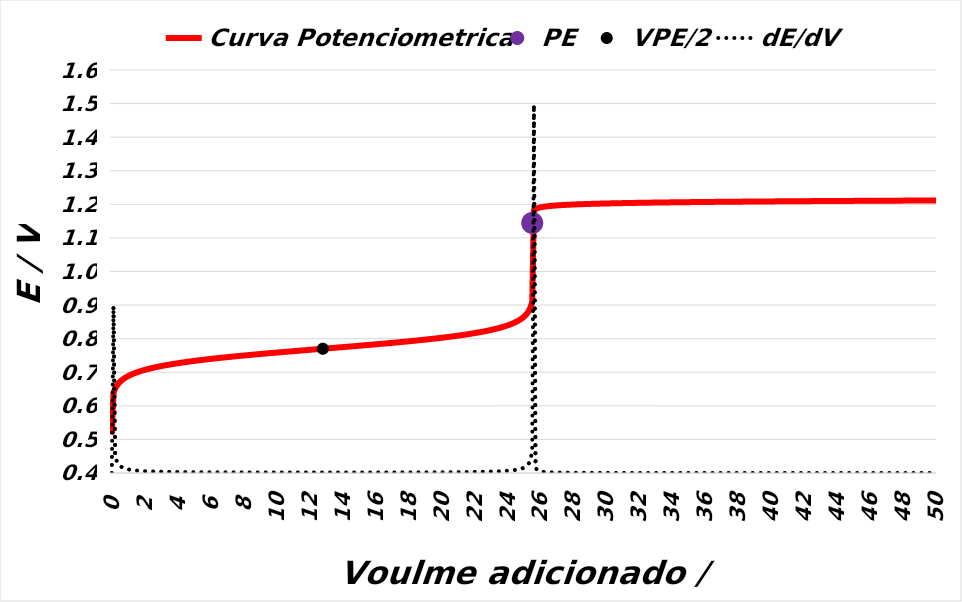
| Category | Curva Potenciometrica | PE | VPE/2 |
|---|---|---|---|
| 0.0 | 0.515 | 0 | 0 |
| 0.1 | 0.638 | 0 | 0 |
| 0.2 | 0.651 | 0 | 0 |
| 0.3 | 0.66 | 0 | 0 |
| 0.4 | 0.666 | 0 | 0 |
| 0.5 | 0.672 | 0 | 0 |
| 0.6 | 0.676 | 0 | 0 |
| 0.7 | 0.68 | 0 | 0 |
| 0.8 | 0.683 | 0 | 0 |
| 0.9 | 0.686 | 0 | 0 |
| 1.0 | 0.689 | 0 | 0 |
| 1.1 | 0.691 | 0 | 0 |
| 1.2 | 0.694 | 0 | 0 |
| 1.3 | 0.696 | 0 | 0 |
| 1.4 | 0.698 | 0 | 0 |
| 1.5 | 0.699 | 0 | 0 |
| 1.6 | 0.701 | 0 | 0 |
| 1.7 | 0.703 | 0 | 0 |
| 1.8 | 0.704 | 0 | 0 |
| 1.9 | 0.706 | 0 | 0 |
| 2.0 | 0.707 | 0 | 0 |
| 2.1 | 0.708 | 0 | 0 |
| 2.2 | 0.71 | 0 | 0 |
| 2.3 | 0.711 | 0 | 0 |
| 2.4 | 0.712 | 0 | 0 |
| 2.5 | 0.713 | 0 | 0 |
| 2.6 | 0.714 | 0 | 0 |
| 2.7 | 0.715 | 0 | 0 |
| 2.8 | 0.716 | 0 | 0 |
| 2.9 | 0.717 | 0 | 0 |
| 3.0 | 0.718 | 0 | 0 |
| 3.1 | 0.719 | 0 | 0 |
| 3.2 | 0.72 | 0 | 0 |
| 3.3 | 0.721 | 0 | 0 |
| 3.4 | 0.722 | 0 | 0 |
| 3.5 | 0.723 | 0 | 0 |
| 3.6 | 0.724 | 0 | 0 |
| 3.7 | 0.725 | 0 | 0 |
| 3.8 | 0.725 | 0 | 0 |
| 3.9 | 0.726 | 0 | 0 |
| 4.0 | 0.727 | 0 | 0 |
| 4.1 | 0.728 | 0 | 0 |
| 4.2 | 0.728 | 0 | 0 |
| 4.3 | 0.729 | 0 | 0 |
| 4.4 | 0.73 | 0 | 0 |
| 4.5 | 0.73 | 0 | 0 |
| 4.6 | 0.731 | 0 | 0 |
| 4.7 | 0.732 | 0 | 0 |
| 4.8 | 0.732 | 0 | 0 |
| 4.9 | 0.733 | 0 | 0 |
| 5.0 | 0.734 | 0 | 0 |
| 5.1 | 0.734 | 0 | 0 |
| 5.2 | 0.735 | 0 | 0 |
| 5.3 | 0.736 | 0 | 0 |
| 5.4 | 0.736 | 0 | 0 |
| 5.5 | 0.737 | 0 | 0 |
| 5.6 | 0.737 | 0 | 0 |
| 5.7 | 0.738 | 0 | 0 |
| 5.8 | 0.739 | 0 | 0 |
| 5.9 | 0.739 | 0 | 0 |
| 6.0 | 0.74 | 0 | 0 |
| 6.1 | 0.74 | 0 | 0 |
| 6.2 | 0.741 | 0 | 0 |
| 6.3 | 0.741 | 0 | 0 |
| 6.4 | 0.742 | 0 | 0 |
| 6.5 | 0.742 | 0 | 0 |
| 6.6 | 0.743 | 0 | 0 |
| 6.7 | 0.743 | 0 | 0 |
| 6.8 | 0.744 | 0 | 0 |
| 6.9 | 0.744 | 0 | 0 |
| 7.0 | 0.745 | 0 | 0 |
| 7.1 | 0.745 | 0 | 0 |
| 7.2 | 0.746 | 0 | 0 |
| 7.3 | 0.746 | 0 | 0 |
| 7.4 | 0.747 | 0 | 0 |
| 7.5 | 0.747 | 0 | 0 |
| 7.6 | 0.748 | 0 | 0 |
| 7.7 | 0.748 | 0 | 0 |
| 7.8 | 0.749 | 0 | 0 |
| 7.9 | 0.749 | 0 | 0 |
| 8.0 | 0.75 | 0 | 0 |
| 8.1 | 0.75 | 0 | 0 |
| 8.2 | 0.751 | 0 | 0 |
| 8.3 | 0.751 | 0 | 0 |
| 8.4 | 0.752 | 0 | 0 |
| 8.5 | 0.752 | 0 | 0 |
| 8.6 | 0.753 | 0 | 0 |
| 8.7 | 0.753 | 0 | 0 |
| 8.8 | 0.753 | 0 | 0 |
| 8.9 | 0.754 | 0 | 0 |
| 9.0 | 0.754 | 0 | 0 |
| 9.1 | 0.755 | 0 | 0 |
| 9.2 | 0.755 | 0 | 0 |
| 9.3 | 0.756 | 0 | 0 |
| 9.4 | 0.756 | 0 | 0 |
| 9.5 | 0.756 | 0 | 0 |
| 9.6 | 0.757 | 0 | 0 |
| 9.7 | 0.757 | 0 | 0 |
| 9.8 | 0.758 | 0 | 0 |
| 9.9 | 0.758 | 0 | 0 |
| 10.0 | 0.759 | 0 | 0 |
| 10.1 | 0.759 | 0 | 0 |
| 10.2 | 0.759 | 0 | 0 |
| 10.3 | 0.76 | 0 | 0 |
| 10.4 | 0.76 | 0 | 0 |
| 10.5 | 0.761 | 0 | 0 |
| 10.6 | 0.761 | 0 | 0 |
| 10.7 | 0.762 | 0 | 0 |
| 10.8 | 0.762 | 0 | 0 |
| 10.9 | 0.762 | 0 | 0 |
| 11.0 | 0.763 | 0 | 0 |
| 11.1 | 0.763 | 0 | 0 |
| 11.2 | 0.764 | 0 | 0 |
| 11.3 | 0.764 | 0 | 0 |
| 11.4 | 0.764 | 0 | 0 |
| 11.5 | 0.765 | 0 | 0 |
| 11.6 | 0.765 | 0 | 0 |
| 11.7 | 0.766 | 0 | 0 |
| 11.8 | 0.766 | 0 | 0 |
| 11.9 | 0.766 | 0 | 0 |
| 12.0 | 0.767 | 0 | 0 |
| 12.1 | 0.767 | 0 | 0 |
| 12.2 | 0.768 | 0 | 0 |
| 12.3 | 0.768 | 0 | 0 |
| 12.4 | 0.768 | 0 | 0 |
| 12.5 | 0.769 | 0 | 0 |
| 12.6 | 0.769 | 0 | 0 |
| 12.7 | 0.77 | 0 | 0 |
| 12.8 | 0.77 | 0 | 0.77 |
| 12.9 | 0.77 | 0 | 0 |
| 13.0 | 0.771 | 0 | 0 |
| 13.1 | 0.771 | 0 | 0 |
| 13.2 | 0.772 | 0 | 0 |
| 13.3 | 0.772 | 0 | 0 |
| 13.4 | 0.772 | 0 | 0 |
| 13.5 | 0.773 | 0 | 0 |
| 13.6 | 0.773 | 0 | 0 |
| 13.7 | 0.774 | 0 | 0 |
| 13.8 | 0.774 | 0 | 0 |
| 13.9 | 0.774 | 0 | 0 |
| 14.0 | 0.775 | 0 | 0 |
| 14.1 | 0.775 | 0 | 0 |
| 14.2 | 0.776 | 0 | 0 |
| 14.3 | 0.776 | 0 | 0 |
| 14.4 | 0.776 | 0 | 0 |
| 14.5 | 0.777 | 0 | 0 |
| 14.6 | 0.777 | 0 | 0 |
| 14.7 | 0.778 | 0 | 0 |
| 14.8 | 0.778 | 0 | 0 |
| 14.9 | 0.779 | 0 | 0 |
| 15.0 | 0.779 | 0 | 0 |
| 15.1 | 0.779 | 0 | 0 |
| 15.2 | 0.78 | 0 | 0 |
| 15.3 | 0.78 | 0 | 0 |
| 15.4 | 0.781 | 0 | 0 |
| 15.5 | 0.781 | 0 | 0 |
| 15.6 | 0.781 | 0 | 0 |
| 15.7 | 0.782 | 0 | 0 |
| 15.8 | 0.782 | 0 | 0 |
| 15.9 | 0.783 | 0 | 0 |
| 16.0 | 0.783 | 0 | 0 |
| 16.1 | 0.784 | 0 | 0 |
| 16.2 | 0.784 | 0 | 0 |
| 16.3 | 0.784 | 0 | 0 |
| 16.4 | 0.785 | 0 | 0 |
| 16.5 | 0.785 | 0 | 0 |
| 16.6 | 0.786 | 0 | 0 |
| 16.7 | 0.786 | 0 | 0 |
| 16.8 | 0.787 | 0 | 0 |
| 16.9 | 0.787 | 0 | 0 |
| 17.0 | 0.788 | 0 | 0 |
| 17.1 | 0.788 | 0 | 0 |
| 17.2 | 0.788 | 0 | 0 |
| 17.3 | 0.789 | 0 | 0 |
| 17.4 | 0.789 | 0 | 0 |
| 17.5 | 0.79 | 0 | 0 |
| 17.6 | 0.79 | 0 | 0 |
| 17.7 | 0.791 | 0 | 0 |
| 17.8 | 0.791 | 0 | 0 |
| 17.9 | 0.792 | 0 | 0 |
| 18.0 | 0.792 | 0 | 0 |
| 18.1 | 0.793 | 0 | 0 |
| 18.2 | 0.793 | 0 | 0 |
| 18.3 | 0.794 | 0 | 0 |
| 18.4 | 0.794 | 0 | 0 |
| 18.5 | 0.795 | 0 | 0 |
| 18.6 | 0.795 | 0 | 0 |
| 18.7 | 0.796 | 0 | 0 |
| 18.8 | 0.796 | 0 | 0 |
| 18.9 | 0.797 | 0 | 0 |
| 19.0 | 0.797 | 0 | 0 |
| 19.1 | 0.798 | 0 | 0 |
| 19.2 | 0.798 | 0 | 0 |
| 19.3 | 0.799 | 0 | 0 |
| 19.4 | 0.799 | 0 | 0 |
| 19.5 | 0.8 | 0 | 0 |
| 19.6 | 0.8 | 0 | 0 |
| 19.7 | 0.801 | 0 | 0 |
| 19.8 | 0.802 | 0 | 0 |
| 19.9 | 0.802 | 0 | 0 |
| 20.0 | 0.803 | 0 | 0 |
| 20.1 | 0.803 | 0 | 0 |
| 20.2 | 0.804 | 0 | 0 |
| 20.3 | 0.804 | 0 | 0 |
| 20.4 | 0.805 | 0 | 0 |
| 20.5 | 0.806 | 0 | 0 |
| 20.6 | 0.806 | 0 | 0 |
| 20.7 | 0.807 | 0 | 0 |
| 20.8 | 0.808 | 0 | 0 |
| 20.9 | 0.808 | 0 | 0 |
| 21.0 | 0.809 | 0 | 0 |
| 21.1 | 0.81 | 0 | 0 |
| 21.2 | 0.81 | 0 | 0 |
| 21.3 | 0.811 | 0 | 0 |
| 21.4 | 0.812 | 0 | 0 |
| 21.5 | 0.813 | 0 | 0 |
| 21.6 | 0.813 | 0 | 0 |
| 21.7 | 0.814 | 0 | 0 |
| 21.8 | 0.815 | 0 | 0 |
| 21.9 | 0.816 | 0 | 0 |
| 22.0 | 0.816 | 0 | 0 |
| 22.1 | 0.817 | 0 | 0 |
| 22.2 | 0.818 | 0 | 0 |
| 22.3 | 0.819 | 0 | 0 |
| 22.4 | 0.82 | 0 | 0 |
| 22.5 | 0.821 | 0 | 0 |
| 22.6 | 0.822 | 0 | 0 |
| 22.7 | 0.823 | 0 | 0 |
| 22.8 | 0.824 | 0 | 0 |
| 22.9 | 0.825 | 0 | 0 |
| 23.0 | 0.826 | 0 | 0 |
| 23.1 | 0.827 | 0 | 0 |
| 23.2 | 0.828 | 0 | 0 |
| 23.3 | 0.829 | 0 | 0 |
| 23.4 | 0.831 | 0 | 0 |
| 23.5 | 0.832 | 0 | 0 |
| 23.6 | 0.833 | 0 | 0 |
| 23.7 | 0.835 | 0 | 0 |
| 23.8 | 0.836 | 0 | 0 |
| 23.9 | 0.838 | 0 | 0 |
| 24.0 | 0.839 | 0 | 0 |
| 24.1 | 0.841 | 0 | 0 |
| 24.2 | 0.843 | 0 | 0 |
| 24.3 | 0.845 | 0 | 0 |
| 24.4 | 0.847 | 0 | 0 |
| 24.5 | 0.85 | 0 | 0 |
| 24.6 | 0.852 | 0 | 0 |
| 24.7 | 0.855 | 0 | 0 |
| 24.8 | 0.858 | 0 | 0 |
| 24.9 | 0.861 | 0 | 0 |
| 25.0 | 0.865 | 0 | 0 |
| 25.1 | 0.87 | 0 | 0 |
| 25.2 | 0.876 | 0 | 0 |
| 25.3 | 0.883 | 0 | 0 |
| 25.4 | 0.893 | 0 | 0 |
| 25.5 | 0.91 | 1.145 | 0 |
| 25.6 | 1.182 | 0 | 0 |
| 25.7 | 1.186 | 0 | 0 |
| 25.8 | 1.188 | 0 | 0 |
| 25.9 | 1.19 | 0 | 0 |
| 26.0 | 1.191 | 0 | 0 |
| 26.1 | 1.192 | 0 | 0 |
| 26.2 | 1.193 | 0 | 0 |
| 26.3 | 1.193 | 0 | 0 |
| 26.4 | 1.194 | 0 | 0 |
| 26.5 | 1.195 | 0 | 0 |
| 26.6 | 1.195 | 0 | 0 |
| 26.7 | 1.196 | 0 | 0 |
| 26.8 | 1.196 | 0 | 0 |
| 26.9 | 1.196 | 0 | 0 |
| 27.0 | 1.197 | 0 | 0 |
| 27.1 | 1.197 | 0 | 0 |
| 27.2 | 1.197 | 0 | 0 |
| 27.3 | 1.198 | 0 | 0 |
| 27.4 | 1.198 | 0 | 0 |
| 27.5 | 1.198 | 0 | 0 |
| 27.6 | 1.199 | 0 | 0 |
| 27.7 | 1.199 | 0 | 0 |
| 27.8 | 1.199 | 0 | 0 |
| 27.9 | 1.199 | 0 | 0 |
| 28.0 | 1.199 | 0 | 0 |
| 28.1 | 1.2 | 0 | 0 |
| 28.2 | 1.2 | 0 | 0 |
| 28.3 | 1.2 | 0 | 0 |
| 28.4 | 1.2 | 0 | 0 |
| 28.5 | 1.2 | 0 | 0 |
| 28.6 | 1.201 | 0 | 0 |
| 28.7 | 1.201 | 0 | 0 |
| 28.8 | 1.201 | 0 | 0 |
| 28.9 | 1.201 | 0 | 0 |
| 29.0 | 1.201 | 0 | 0 |
| 29.1 | 1.201 | 0 | 0 |
| 29.2 | 1.202 | 0 | 0 |
| 29.3 | 1.202 | 0 | 0 |
| 29.4 | 1.202 | 0 | 0 |
| 29.5 | 1.202 | 0 | 0 |
| 29.6 | 1.202 | 0 | 0 |
| 29.7 | 1.202 | 0 | 0 |
| 29.8 | 1.202 | 0 | 0 |
| 29.9 | 1.202 | 0 | 0 |
| 30.0 | 1.203 | 0 | 0 |
| 30.1 | 1.203 | 0 | 0 |
| 30.2 | 1.203 | 0 | 0 |
| 30.3 | 1.203 | 0 | 0 |
| 30.4 | 1.203 | 0 | 0 |
| 30.5 | 1.203 | 0 | 0 |
| 30.6 | 1.203 | 0 | 0 |
| 30.7 | 1.203 | 0 | 0 |
| 30.8 | 1.203 | 0 | 0 |
| 30.9 | 1.204 | 0 | 0 |
| 31.0 | 1.204 | 0 | 0 |
| 31.1 | 1.204 | 0 | 0 |
| 31.2 | 1.204 | 0 | 0 |
| 31.3 | 1.204 | 0 | 0 |
| 31.4 | 1.204 | 0 | 0 |
| 31.5 | 1.204 | 0 | 0 |
| 31.6 | 1.204 | 0 | 0 |
| 31.7 | 1.204 | 0 | 0 |
| 31.8 | 1.204 | 0 | 0 |
| 31.9 | 1.204 | 0 | 0 |
| 32.0 | 1.205 | 0 | 0 |
| 32.1 | 1.205 | 0 | 0 |
| 32.2 | 1.205 | 0 | 0 |
| 32.3 | 1.205 | 0 | 0 |
| 32.4 | 1.205 | 0 | 0 |
| 32.5 | 1.205 | 0 | 0 |
| 32.6 | 1.205 | 0 | 0 |
| 32.7 | 1.205 | 0 | 0 |
| 32.8 | 1.205 | 0 | 0 |
| 32.9 | 1.205 | 0 | 0 |
| 33.0 | 1.205 | 0 | 0 |
| 33.1 | 1.205 | 0 | 0 |
| 33.2 | 1.205 | 0 | 0 |
| 33.3 | 1.205 | 0 | 0 |
| 33.4 | 1.206 | 0 | 0 |
| 33.5 | 1.206 | 0 | 0 |
| 33.6 | 1.206 | 0 | 0 |
| 33.7 | 1.206 | 0 | 0 |
| 33.8 | 1.206 | 0 | 0 |
| 33.9 | 1.206 | 0 | 0 |
| 34.0 | 1.206 | 0 | 0 |
| 34.1 | 1.206 | 0 | 0 |
| 34.2 | 1.206 | 0 | 0 |
| 34.3 | 1.206 | 0 | 0 |
| 34.4 | 1.206 | 0 | 0 |
| 34.5 | 1.206 | 0 | 0 |
| 34.6 | 1.206 | 0 | 0 |
| 34.7 | 1.206 | 0 | 0 |
| 34.8 | 1.206 | 0 | 0 |
| 34.9 | 1.206 | 0 | 0 |
| 35.0 | 1.207 | 0 | 0 |
| 35.1 | 1.207 | 0 | 0 |
| 35.2 | 1.207 | 0 | 0 |
| 35.3 | 1.207 | 0 | 0 |
| 35.4 | 1.207 | 0 | 0 |
| 35.5 | 1.207 | 0 | 0 |
| 35.6 | 1.207 | 0 | 0 |
| 35.7 | 1.207 | 0 | 0 |
| 35.8 | 1.207 | 0 | 0 |
| 35.9 | 1.207 | 0 | 0 |
| 36.0 | 1.207 | 0 | 0 |
| 36.1 | 1.207 | 0 | 0 |
| 36.2 | 1.207 | 0 | 0 |
| 36.3 | 1.207 | 0 | 0 |
| 36.4 | 1.207 | 0 | 0 |
| 36.5 | 1.207 | 0 | 0 |
| 36.6 | 1.207 | 0 | 0 |
| 36.7 | 1.207 | 0 | 0 |
| 36.8 | 1.207 | 0 | 0 |
| 36.9 | 1.207 | 0 | 0 |
| 37.0 | 1.208 | 0 | 0 |
| 37.1 | 1.208 | 0 | 0 |
| 37.2 | 1.208 | 0 | 0 |
| 37.3 | 1.208 | 0 | 0 |
| 37.4 | 1.208 | 0 | 0 |
| 37.5 | 1.208 | 0 | 0 |
| 37.6 | 1.208 | 0 | 0 |
| 37.7 | 1.208 | 0 | 0 |
| 37.8 | 1.208 | 0 | 0 |
| 37.9 | 1.208 | 0 | 0 |
| 38.0 | 1.208 | 0 | 0 |
| 38.1 | 1.208 | 0 | 0 |
| 38.2 | 1.208 | 0 | 0 |
| 38.3 | 1.208 | 0 | 0 |
| 38.4 | 1.208 | 0 | 0 |
| 38.5 | 1.208 | 0 | 0 |
| 38.6 | 1.208 | 0 | 0 |
| 38.7 | 1.208 | 0 | 0 |
| 38.8 | 1.208 | 0 | 0 |
| 38.9 | 1.208 | 0 | 0 |
| 39.0 | 1.208 | 0 | 0 |
| 39.1 | 1.208 | 0 | 0 |
| 39.2 | 1.208 | 0 | 0 |
| 39.3 | 1.208 | 0 | 0 |
| 39.4 | 1.209 | 0 | 0 |
| 39.5 | 1.209 | 0 | 0 |
| 39.6 | 1.209 | 0 | 0 |
| 39.7 | 1.209 | 0 | 0 |
| 39.8 | 1.209 | 0 | 0 |
| 39.9 | 1.209 | 0 | 0 |
| 40.0 | 1.209 | 0 | 0 |
| 40.1 | 1.209 | 0 | 0 |
| 40.2 | 1.209 | 0 | 0 |
| 40.3 | 1.209 | 0 | 0 |
| 40.4 | 1.209 | 0 | 0 |
| 40.5 | 1.209 | 0 | 0 |
| 40.6 | 1.209 | 0 | 0 |
| 40.7 | 1.209 | 0 | 0 |
| 40.8 | 1.209 | 0 | 0 |
| 40.9 | 1.209 | 0 | 0 |
| 41.0 | 1.209 | 0 | 0 |
| 41.1 | 1.209 | 0 | 0 |
| 41.2 | 1.209 | 0 | 0 |
| 41.3 | 1.209 | 0 | 0 |
| 41.4 | 1.209 | 0 | 0 |
| 41.5 | 1.209 | 0 | 0 |
| 41.6 | 1.209 | 0 | 0 |
| 41.7 | 1.209 | 0 | 0 |
| 41.8 | 1.209 | 0 | 0 |
| 41.9 | 1.209 | 0 | 0 |
| 42.0 | 1.209 | 0 | 0 |
| 42.1 | 1.209 | 0 | 0 |
| 42.2 | 1.209 | 0 | 0 |
| 42.3 | 1.21 | 0 | 0 |
| 42.4 | 1.21 | 0 | 0 |
| 42.5 | 1.21 | 0 | 0 |
| 42.6 | 1.21 | 0 | 0 |
| 42.7 | 1.21 | 0 | 0 |
| 42.8 | 1.21 | 0 | 0 |
| 42.9 | 1.21 | 0 | 0 |
| 43.0 | 1.21 | 0 | 0 |
| 43.1 | 1.21 | 0 | 0 |
| 43.2 | 1.21 | 0 | 0 |
| 43.3 | 1.21 | 0 | 0 |
| 43.4 | 1.21 | 0 | 0 |
| 43.5 | 1.21 | 0 | 0 |
| 43.6 | 1.21 | 0 | 0 |
| 43.7 | 1.21 | 0 | 0 |
| 43.8 | 1.21 | 0 | 0 |
| 43.9 | 1.21 | 0 | 0 |
| 44.0 | 1.21 | 0 | 0 |
| 44.1 | 1.21 | 0 | 0 |
| 44.2 | 1.21 | 0 | 0 |
| 44.3 | 1.21 | 0 | 0 |
| 44.4 | 1.21 | 0 | 0 |
| 44.5 | 1.21 | 0 | 0 |
| 44.6 | 1.21 | 0 | 0 |
| 44.7 | 1.21 | 0 | 0 |
| 44.8 | 1.21 | 0 | 0 |
| 44.9 | 1.21 | 0 | 0 |
| 45.0 | 1.21 | 0 | 0 |
| 45.1 | 1.21 | 0 | 0 |
| 45.2 | 1.21 | 0 | 0 |
| 45.3 | 1.21 | 0 | 0 |
| 45.4 | 1.21 | 0 | 0 |
| 45.5 | 1.21 | 0 | 0 |
| 45.6 | 1.21 | 0 | 0 |
| 45.7 | 1.21 | 0 | 0 |
| 45.8 | 1.211 | 0 | 0 |
| 45.9 | 1.211 | 0 | 0 |
| 46.0 | 1.211 | 0 | 0 |
| 46.1 | 1.211 | 0 | 0 |
| 46.2 | 1.211 | 0 | 0 |
| 46.3 | 1.211 | 0 | 0 |
| 46.4 | 1.211 | 0 | 0 |
| 46.5 | 1.211 | 0 | 0 |
| 46.6 | 1.211 | 0 | 0 |
| 46.7 | 1.211 | 0 | 0 |
| 46.8 | 1.211 | 0 | 0 |
| 46.9 | 1.211 | 0 | 0 |
| 47.0 | 1.211 | 0 | 0 |
| 47.1 | 1.211 | 0 | 0 |
| 47.2 | 1.211 | 0 | 0 |
| 47.3 | 1.211 | 0 | 0 |
| 47.4 | 1.211 | 0 | 0 |
| 47.5 | 1.211 | 0 | 0 |
| 47.6 | 1.211 | 0 | 0 |
| 47.7 | 1.211 | 0 | 0 |
| 47.8 | 1.211 | 0 | 0 |
| 47.9 | 1.211 | 0 | 0 |
| 48.0 | 1.211 | 0 | 0 |
| 48.1 | 1.211 | 0 | 0 |
| 48.2 | 1.211 | 0 | 0 |
| 48.3 | 1.211 | 0 | 0 |
| 48.4 | 1.211 | 0 | 0 |
| 48.5 | 1.211 | 0 | 0 |
| 48.6 | 1.211 | 0 | 0 |
| 48.7 | 1.211 | 0 | 0 |
| 48.8 | 1.211 | 0 | 0 |
| 48.9 | 1.211 | 0 | 0 |
| 49.0 | 1.211 | 0 | 0 |
| 49.1 | 1.211 | 0 | 0 |
| 49.2 | 1.211 | 0 | 0 |
| 49.3 | 1.211 | 0 | 0 |
| 49.4 | 1.211 | 0 | 0 |
| 49.5 | 1.211 | 0 | 0 |
| 49.6 | 1.211 | 0 | 0 |
| 49.7 | 1.211 | 0 | 0 |
| 49.8 | 1.211 | 0 | 0 |
| 49.9 | 1.211 | 0 | 0 |
| 50.0 | 1.211 | 0 | 0 |